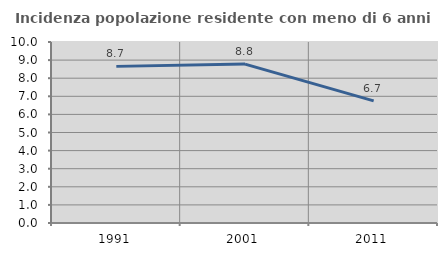
| Category | Incidenza popolazione residente con meno di 6 anni |
|---|---|
| 1991.0 | 8.653 |
| 2001.0 | 8.778 |
| 2011.0 | 6.744 |